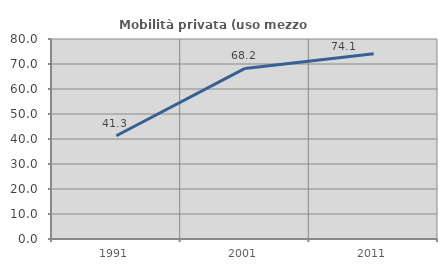
| Category | Mobilità privata (uso mezzo privato) |
|---|---|
| 1991.0 | 41.315 |
| 2001.0 | 68.243 |
| 2011.0 | 74.096 |